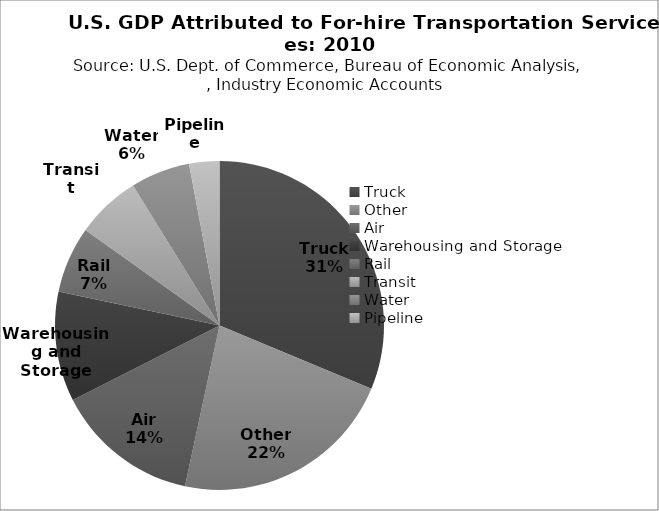
| Category | Series 0 |
|---|---|
| Truck | 31.6 |
| Other | 22.3 |
| Air | 14.3 |
| Warehousing and Storage | 10.9 |
| Rail | 6.6 |
| Transit | 6.4 |
| Water | 5.9 |
| Pipeline | 3 |